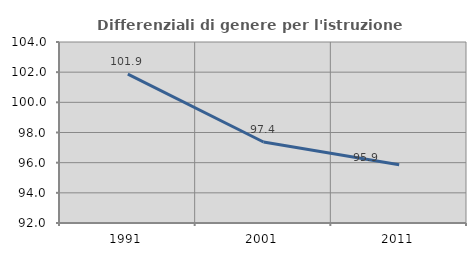
| Category | Differenziali di genere per l'istruzione superiore |
|---|---|
| 1991.0 | 101.87 |
| 2001.0 | 97.371 |
| 2011.0 | 95.867 |